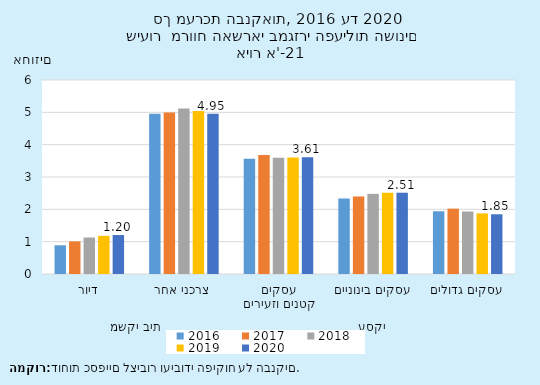
| Category | 2016 | 2017 | 2018 | 2019 | 2020 |
|---|---|---|---|---|---|
| 0 | 0.888 | 1.009 | 1.129 | 1.18 | 1.205 |
| 1 | 4.958 | 4.992 | 5.116 | 5.038 | 4.953 |
| 2 | 3.568 | 3.684 | 3.598 | 3.599 | 3.613 |
| 3 | 2.335 | 2.395 | 2.479 | 2.514 | 2.514 |
| 4 | 1.941 | 2.021 | 1.932 | 1.875 | 1.848 |